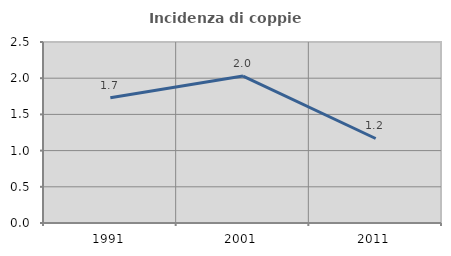
| Category | Incidenza di coppie miste |
|---|---|
| 1991.0 | 1.729 |
| 2001.0 | 2.03 |
| 2011.0 | 1.167 |